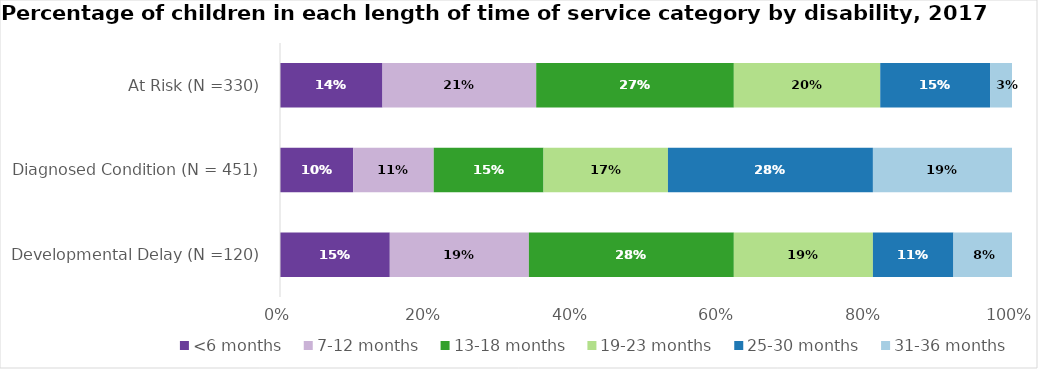
| Category | <6 months | 7-12 months | 13-18 months | 19-23 months | 25-30 months | 31-36 months |
|---|---|---|---|---|---|---|
| Developmental Delay (N =120) | 0.15 | 0.19 | 0.28 | 0.19 | 0.11 | 0.08 |
| Diagnosed Condition (N = 451) | 0.1 | 0.11 | 0.15 | 0.17 | 0.28 | 0.19 |
| At Risk (N =330) | 0.14 | 0.21 | 0.27 | 0.2 | 0.15 | 0.03 |